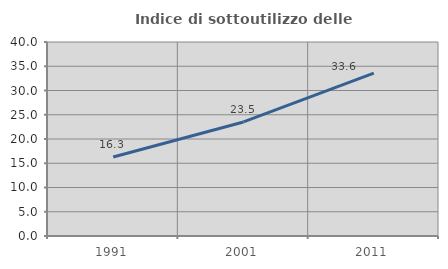
| Category | Indice di sottoutilizzo delle abitazioni  |
|---|---|
| 1991.0 | 16.291 |
| 2001.0 | 23.512 |
| 2011.0 | 33.578 |